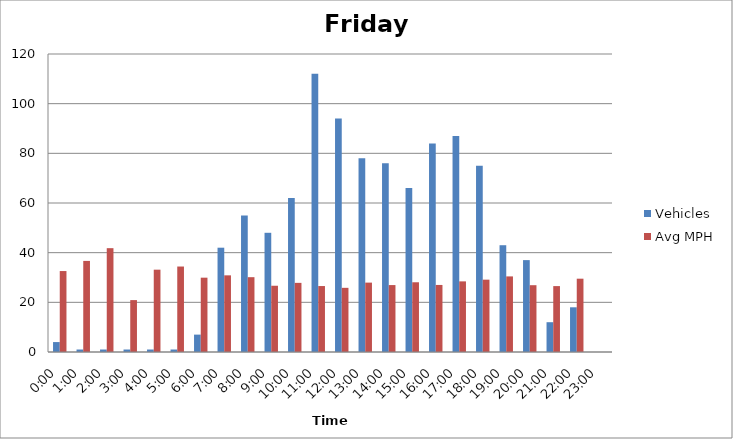
| Category | Vehicles | Avg MPH |
|---|---|---|
| 0:00 | 4 | 32.6 |
| 1:00 | 1 | 36.68 |
| 2:00 | 1 | 41.81 |
| 3:00 | 1 | 20.9 |
| 4:00 | 1 | 33.15 |
| 5:00 | 1 | 34.42 |
| 6:00 | 7 | 29.93 |
| 7:00 | 42 | 30.87 |
| 8:00 | 55 | 30.13 |
| 9:00 | 48 | 26.68 |
| 10:00 | 62 | 27.84 |
| 11:00 | 112 | 26.56 |
| 12:00 | 94 | 25.84 |
| 13:00 | 78 | 27.94 |
| 14:00 | 76 | 26.95 |
| 15:00 | 66 | 28.08 |
| 16:00 | 84 | 27 |
| 17:00 | 87 | 28.44 |
| 18:00 | 75 | 29.13 |
| 19:00 | 43 | 30.44 |
| 20:00 | 37 | 26.9 |
| 21:00 | 12 | 26.54 |
| 22:00 | 18 | 29.52 |
| 23:00 | 0 | 0 |